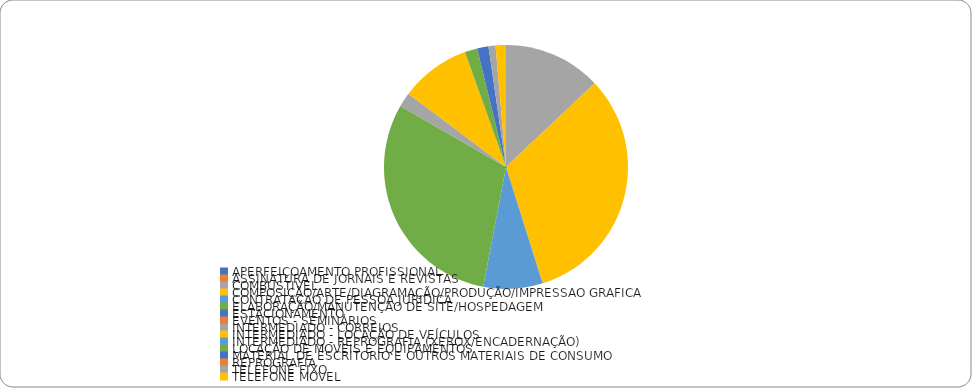
| Category | Series 0 |
|---|---|
| APERFEIÇOAMENTO PROFISSIONAL | 0 |
| ASSINATURA DE JORNAIS E REVISTAS | 0 |
| COMBUSTIVEL | 36029.16 |
| COMPOSIÇÃO/ARTE/DIAGRAMAÇÃO/PRODUÇÃO/IMPRESSAO GRAFICA | 89652.61 |
| CONTRATAÇAO DE PESSOA JURIDICA | 21854.68 |
| ELABORAÇÃO/MANUTENÇAO DE SITE/HOSPEDAGEM | 84434.99 |
| ESTACIONAMENTO | 0 |
| EVENTOS - SEMINÁRIOS | 0 |
| INTERMEDIADO - CORREIOS | 5370.073 |
| INTERMEDIADO - LOCAÇÃO DE VEÍCULOS | 25833.77 |
| INTERMEDIADO - REPROGRAFIA (XEROX/ENCADERNAÇÃO) | 0 |
| LOCAÇÃO DE MOVEIS E EQUIPAMENTOS | 4610.753 |
| MATERIAL DE ESCRITORIO E OUTROS MATERIAIS DE CONSUMO | 4199.2 |
| REPROGRAFIA | 0 |
| TELEFONE FIXO | 2593.85 |
| TELEFONE MOVEL | 3803.923 |